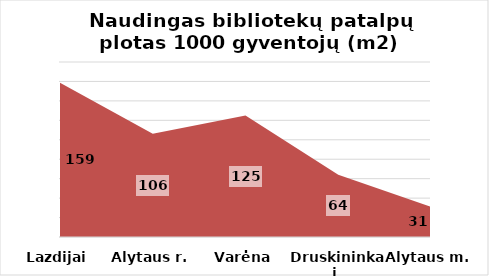
| Category | Series 0 |
|---|---|
| Lazdijai | 158.699 |
| Alytaus r. | 106.316 |
| Varėna | 125.024 |
| Druskininkai  | 63.958 |
| Alytaus m. | 30.985 |